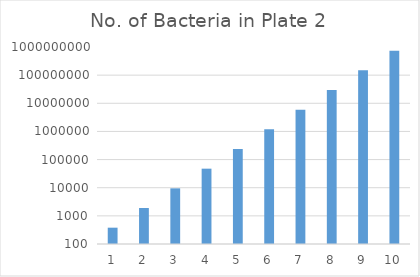
| Category | No. of Bacteria in Plate 2 |
|---|---|
| 1.0 | 380 |
| 2.0 | 1900 |
| 3.0 | 9500 |
| 4.0 | 47500 |
| 5.0 | 237500 |
| 6.0 | 1187500 |
| 7.0 | 5937500 |
| 8.0 | 29687500 |
| 9.0 | 148437500 |
| 10.0 | 742187500 |